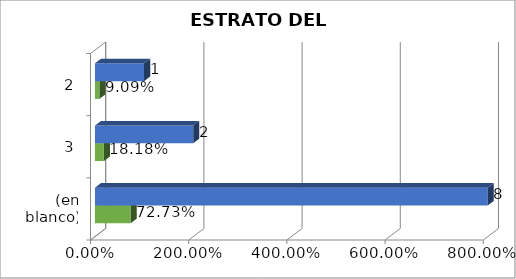
| Category | Cuenta de Número petición2 | Cuenta de Número petición |
|---|---|---|
| (en blanco) | 0.727 | 8 |
| 3 | 0.182 | 2 |
| 2 | 0.091 | 1 |